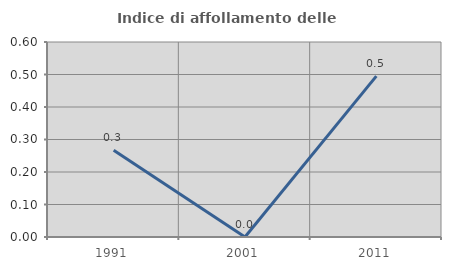
| Category | Indice di affollamento delle abitazioni  |
|---|---|
| 1991.0 | 0.267 |
| 2001.0 | 0 |
| 2011.0 | 0.495 |